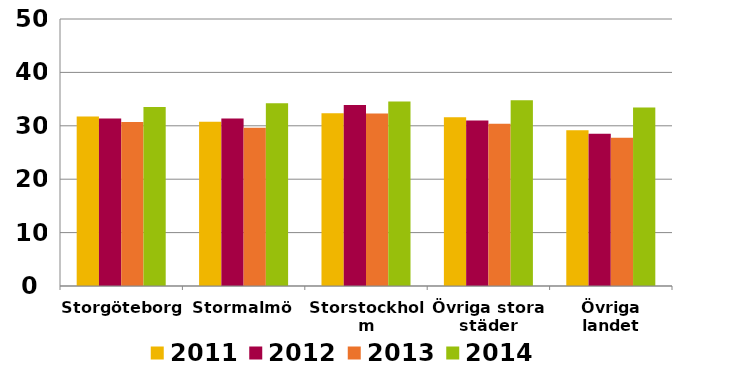
| Category | 2011 | 2012 | 2013 | 2014 |
|---|---|---|---|---|
| Storgöteborg | 31.745 | 31.361 | 30.704 | 33.529 |
| Stormalmö | 30.754 | 31.361 | 29.638 | 34.231 |
| Storstockholm | 32.346 | 33.876 | 32.286 | 34.541 |
| Övriga stora städer | 31.58 | 31.013 | 30.364 | 34.783 |
| Övriga landet | 29.178 | 28.518 | 27.769 | 33.422 |